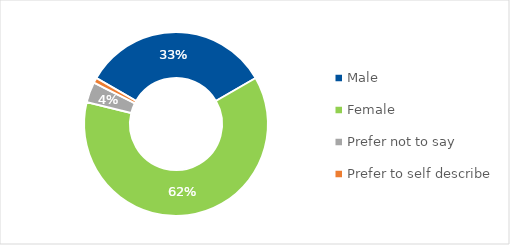
| Category | Series 0 |
|---|---|
| Male | 0.333 |
| Female | 0.622 |
| Prefer not to say | 0.036 |
| Prefer to self describe | 0.009 |